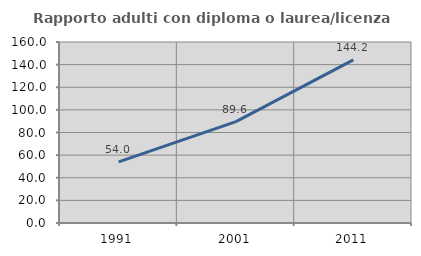
| Category | Rapporto adulti con diploma o laurea/licenza media  |
|---|---|
| 1991.0 | 54.015 |
| 2001.0 | 89.583 |
| 2011.0 | 144.218 |